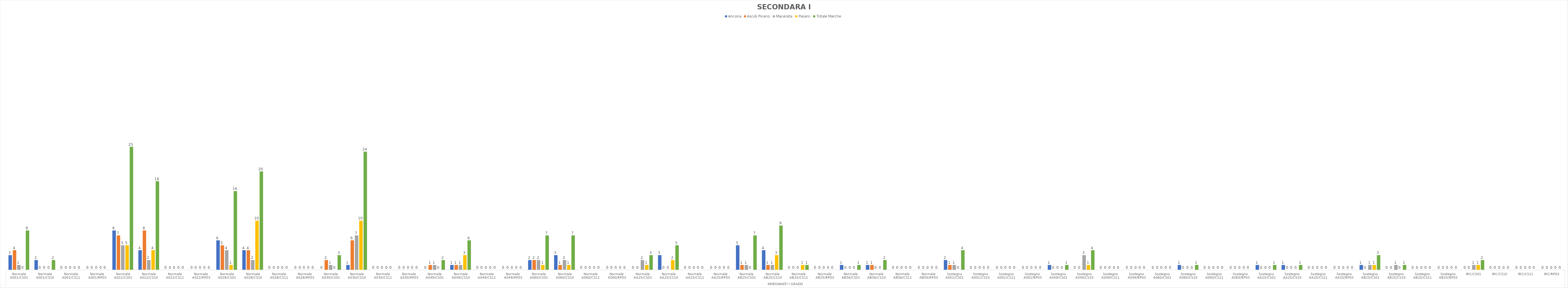
| Category | Ancona | Ascoli Piceno | Macerata | Pesaro | Totale Marche |
|---|---|---|---|---|---|
| 0 | 3 | 4 | 1 | 0 | 8 |
| 1 | 2 | 0 | 0 | 0 | 2 |
| 2 | 0 | 0 | 0 | 0 | 0 |
| 3 | 0 | 0 | 0 | 0 | 0 |
| 4 | 8 | 7 | 5 | 5 | 25 |
| 5 | 4 | 8 | 2 | 4 | 18 |
| 6 | 0 | 0 | 0 | 0 | 0 |
| 7 | 0 | 0 | 0 | 0 | 0 |
| 8 | 6 | 5 | 4 | 1 | 16 |
| 9 | 4 | 4 | 2 | 10 | 20 |
| 10 | 0 | 0 | 0 | 0 | 0 |
| 11 | 0 | 0 | 0 | 0 | 0 |
| 12 | 0 | 2 | 1 | 0 | 3 |
| 13 | 1 | 6 | 7 | 10 | 24 |
| 14 | 0 | 0 | 0 | 0 | 0 |
| 15 | 0 | 0 | 0 | 0 | 0 |
| 16 | 0 | 1 | 1 | 0 | 2 |
| 17 | 1 | 1 | 1 | 3 | 6 |
| 18 | 0 | 0 | 0 | 0 | 0 |
| 19 | 0 | 0 | 0 | 0 | 0 |
| 20 | 2 | 2 | 2 | 1 | 7 |
| 21 | 3 | 1 | 2 | 1 | 7 |
| 22 | 0 | 0 | 0 | 0 | 0 |
| 23 | 0 | 0 | 0 | 0 | 0 |
| 24 | 0 | 0 | 2 | 1 | 3 |
| 25 | 3 | 0 | 0 | 2 | 5 |
| 26 | 0 | 0 | 0 | 0 | 0 |
| 27 | 0 | 0 | 0 | 0 | 0 |
| 28 | 5 | 1 | 1 | 0 | 7 |
| 29 | 4 | 1 | 1 | 3 | 9 |
| 30 | 0 | 0 | 0 | 1 | 1 |
| 31 | 0 | 0 | 0 | 0 | 0 |
| 32 | 1 | 0 | 0 | 0 | 1 |
| 33 | 1 | 1 | 0 | 0 | 2 |
| 34 | 0 | 0 | 0 | 0 | 0 |
| 35 | 0 | 0 | 0 | 0 | 0 |
| 36 | 2 | 1 | 1 | 0 | 4 |
| 37 | 0 | 0 | 0 | 0 | 0 |
| 38 | 0 | 0 | 0 | 0 | 0 |
| 39 | 0 | 0 | 0 | 0 | 0 |
| 40 | 1 | 0 | 0 | 0 | 1 |
| 41 | 0 | 0 | 3 | 1 | 4 |
| 42 | 0 | 0 | 0 | 0 | 0 |
| 43 | 0 | 0 | 0 | 0 | 0 |
| 44 | 0 | 0 | 0 | 0 | 0 |
| 45 | 1 | 0 | 0 | 0 | 1 |
| 46 | 0 | 0 | 0 | 0 | 0 |
| 47 | 0 | 0 | 0 | 0 | 0 |
| 48 | 1 | 0 | 0 | 0 | 1 |
| 49 | 1 | 0 | 0 | 0 | 1 |
| 50 | 0 | 0 | 0 | 0 | 0 |
| 51 | 0 | 0 | 0 | 0 | 0 |
| 52 | 1 | 0 | 1 | 1 | 3 |
| 53 | 0 | 0 | 1 | 0 | 1 |
| 54 | 0 | 0 | 0 | 0 | 0 |
| 55 | 0 | 0 | 0 | 0 | 0 |
| 56 | 0 | 0 | 1 | 1 | 2 |
| 57 | 0 | 0 | 0 | 0 | 0 |
| 58 | 0 | 0 | 0 | 0 | 0 |
| 59 | 0 | 0 | 0 | 0 | 0 |